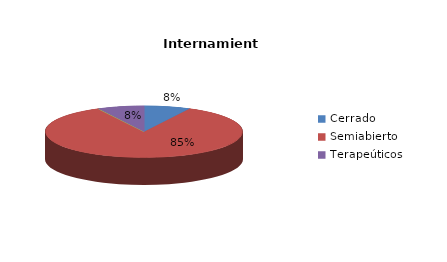
| Category | Series 0 |
|---|---|
| Cerrado | 6 |
| Semiabierto | 67 |
| Abierto | 0 |
| Terapeúticos | 6 |